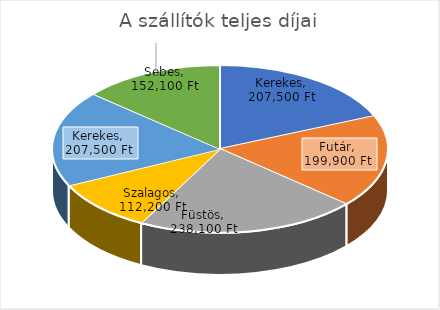
| Category | Series 0 |
|---|---|
| Kerekes | 207500 |
| Futár | 199900 |
| Füstös | 238100 |
| Szalagos | 112200 |
| Kerekes | 207500 |
| Sebes | 152100 |